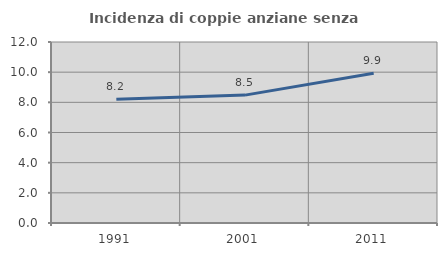
| Category | Incidenza di coppie anziane senza figli  |
|---|---|
| 1991.0 | 8.202 |
| 2001.0 | 8.478 |
| 2011.0 | 9.926 |